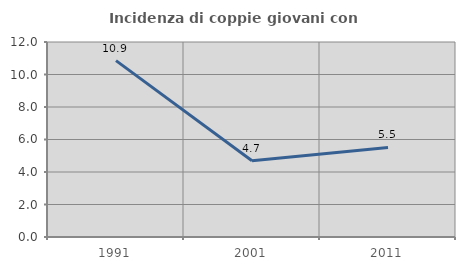
| Category | Incidenza di coppie giovani con figli |
|---|---|
| 1991.0 | 10.853 |
| 2001.0 | 4.688 |
| 2011.0 | 5.512 |